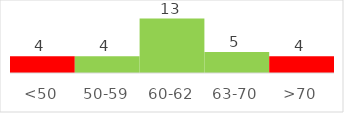
| Category | Series 0 |
|---|---|
| <50 | 4 |
| 50-59 | 4 |
| 60-62 | 13 |
| 63-70 | 5 |
| >70 | 4 |